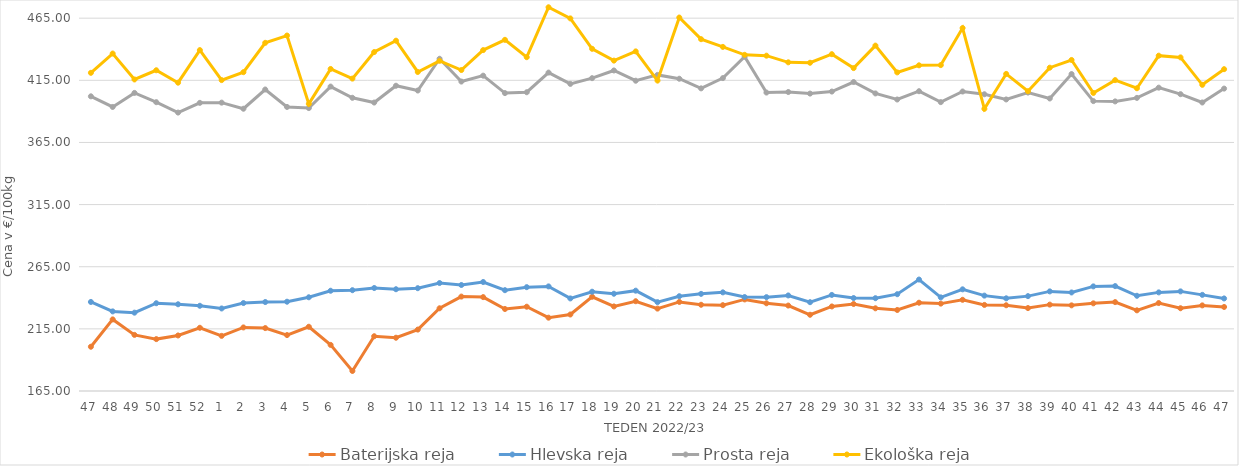
| Category | Baterijska reja | Hlevska reja | Prosta reja | Ekološka reja |
|---|---|---|---|---|
| 47.0 | 200.62 | 236.65 | 402.12 | 421.03 |
| 48.0 | 222.61 | 229.05 | 393.56 | 436.55 |
| 49.0 | 210.16 | 228.03 | 404.87 | 415.69 |
| 50.0 | 206.76 | 235.63 | 397.4 | 423.1 |
| 51.0 | 209.69 | 234.79 | 389.05 | 413.1 |
| 52.0 | 215.87 | 233.58 | 396.87 | 439.31 |
| 1.0 | 209.37 | 231.41 | 397.04 | 415.17 |
| 2.0 | 216.15 | 235.78 | 392.13 | 421.55 |
| 3.0 | 215.63 | 236.58 | 407.61 | 445.17 |
| 4.0 | 210 | 236.85 | 393.58 | 451.04 |
| 5.0 | 216.7 | 240.42 | 392.67 | 396.03 |
| 6.0 | 202.1 | 245.67 | 409.97 | 424.14 |
| 7.0 | 181.11 | 246.12 | 400.94 | 416.38 |
| 8.0 | 209.08 | 247.88 | 397.11 | 437.76 |
| 9.0 | 207.87 | 246.89 | 410.64 | 446.9 |
| 10.0 | 214.42 | 247.73 | 406.8 | 421.72 |
| 11.0 | 231.56 | 251.88 | 432.34 | 430.69 |
| 12.0 | 240.97 | 250.3 | 414 | 423.28 |
| 13.0 | 240.55 | 252.7 | 418.74 | 439.31 |
| 14.0 | 230.99 | 246.12 | 404.72 | 447.59 |
| 15.0 | 232.82 | 248.56 | 405.42 | 433.62 |
| 16.0 | 224 | 249.17 | 421.22 | 473.79 |
| 17.0 | 226.57 | 239.5 | 412.13 | 464.83 |
| 18.0 | 240.83 | 244.89 | 416.74 | 440.35 |
| 19.0 | 233.05 | 243.26 | 422.93 | 430.86 |
| 20.0 | 237.25 | 245.73 | 414.68 | 438.28 |
| 21.0 | 231.3 | 236.5 | 419.36 | 414.83 |
| 22.0 | 236.67 | 241.27 | 416.27 | 465.52 |
| 23.0 | 234.39 | 243.16 | 408.53 | 448.1 |
| 24.0 | 234.08 | 244.37 | 416.78 | 441.9 |
| 25.0 | 238.69 | 240.6 | 434.05 | 435.52 |
| 26.0 | 235.57 | 240.51 | 405.15 | 434.83 |
| 27.0 | 233.75 | 241.89 | 405.58 | 429.48 |
| 28.0 | 226.35 | 236.46 | 404.32 | 429.14 |
| 29.0 | 233.03 | 242.31 | 405.96 | 436.04 |
| 30.0 | 235 | 239.8 | 413.63 | 424.83 |
| 31.0 | 231.55 | 239.67 | 404.46 | 442.93 |
| 32.0 | 230.2 | 242.89 | 399.57 | 421.38 |
| 33.0 | 236.04 | 254.68 | 406.23 | 427.07 |
| 34.0 | 235.32 | 240.35 | 397.45 | 427.24 |
| 35.0 | 238.39 | 246.82 | 406 | 457.07 |
| 36.0 | 234.27 | 241.75 | 403.79 | 392.07 |
| 37.0 | 234 | 239.58 | 399.61 | 420.17 |
| 38.0 | 231.74 | 241.34 | 405.14 | 406.21 |
| 39.0 | 234.5 | 245.15 | 400.39 | 425.17 |
| 40.0 | 233.92 | 244.29 | 420.04 | 431.38 |
| 41.0 | 235.54 | 249.18 | 398.28 | 404.83 |
| 42.0 | 236.54 | 249.42 | 398.03 | 415.17 |
| 43.0 | 229.92 | 241.62 | 400.86 | 408.62 |
| 44.0 | 235.77 | 244.36 | 409.1 | 434.83 |
| 45.0 | 231.6 | 245.16 | 403.86 | 433.45 |
| 46.0 | 233.89 | 242.36 | 397.17 | 411.38 |
| 47.0 | 232.62 | 239.48 | 408.34 | 423.97 |